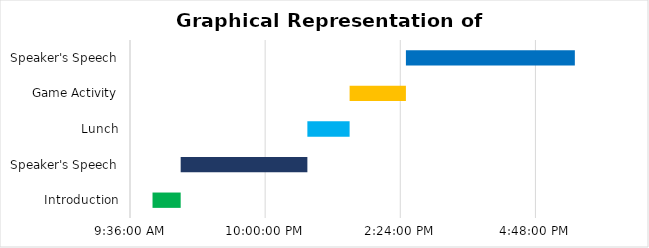
| Category | Start Time | Minutes |
|---|---|---|
| Introduction | 0.417 | 0.021 |
| Speaker's Speech | 0.438 | 0.094 |
| Lunch | 0.531 | 0.031 |
| Game Activity | 0.562 | 0.042 |
| Speaker's Speech | 0.604 | 0.125 |